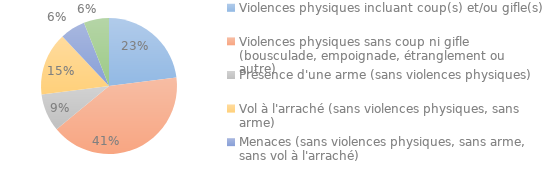
| Category | Series 0 |
|---|---|
| Violences physiques incluant coup(s) et/ou gifle(s) | 0.23 |
| Violences physiques sans coup ni gifle (bousculade, empoignade, étranglement ou autre) | 0.41 |
| Présence d'une arme (sans violences physiques) | 0.09 |
| Vol à l'arraché (sans violences physiques, sans arme) | 0.15 |
| Menaces (sans violences physiques, sans arme, sans vol à l'arraché) | 0.06 |
| NSP | 0.06 |